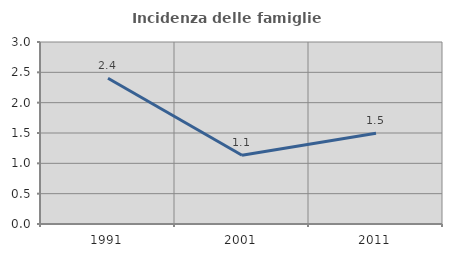
| Category | Incidenza delle famiglie numerose |
|---|---|
| 1991.0 | 2.404 |
| 2001.0 | 1.133 |
| 2011.0 | 1.496 |